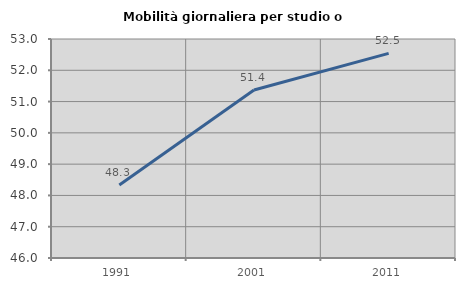
| Category | Mobilità giornaliera per studio o lavoro |
|---|---|
| 1991.0 | 48.333 |
| 2001.0 | 51.369 |
| 2011.0 | 52.539 |